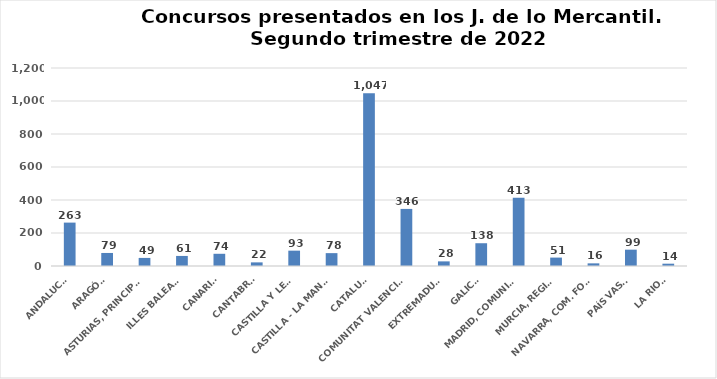
| Category | Series 0 |
|---|---|
| ANDALUCÍA | 263 |
| ARAGÓN | 79 |
| ASTURIAS, PRINCIPADO | 49 |
| ILLES BALEARS | 61 |
| CANARIAS | 74 |
| CANTABRIA | 22 |
| CASTILLA Y LEÓN | 93 |
| CASTILLA - LA MANCHA | 78 |
| CATALUÑA | 1047 |
| COMUNITAT VALENCIANA | 346 |
| EXTREMADURA | 28 |
| GALICIA | 138 |
| MADRID, COMUNIDAD | 413 |
| MURCIA, REGIÓN | 51 |
| NAVARRA, COM. FORAL | 16 |
| PAÍS VASCO | 99 |
| LA RIOJA | 14 |